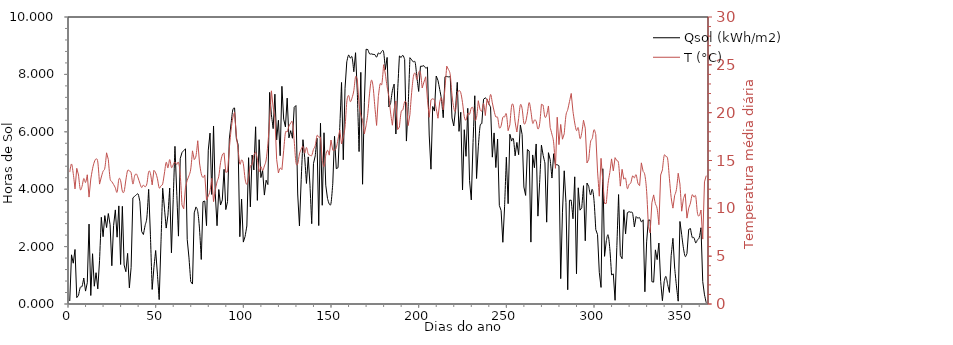
| Category | Qsol (kWh/m2) |
|---|---|
| 1.0 | 0.103 |
| 2.0 | 1.714 |
| 3.0 | 1.421 |
| 4.0 | 1.9 |
| 5.0 | 0.222 |
| 6.0 | 0.301 |
| 7.0 | 0.579 |
| 8.0 | 0.615 |
| 9.0 | 0.905 |
| 10.0 | 0.449 |
| 11.0 | 0.74 |
| 12.0 | 2.784 |
| 13.0 | 0.296 |
| 14.0 | 1.752 |
| 15.0 | 0.619 |
| 16.0 | 1.091 |
| 17.0 | 0.527 |
| 18.0 | 1.522 |
| 19.0 | 3.022 |
| 20.0 | 2.345 |
| 21.0 | 3.08 |
| 22.0 | 2.663 |
| 23.0 | 3.152 |
| 24.0 | 2.765 |
| 25.0 | 1.333 |
| 26.0 | 2.736 |
| 27.0 | 3.279 |
| 28.0 | 2.328 |
| 29.0 | 3.418 |
| 30.0 | 1.377 |
| 31.0 | 3.404 |
| 32.0 | 1.36 |
| 33.0 | 1.125 |
| 34.0 | 1.764 |
| 35.0 | 0.563 |
| 36.0 | 1.277 |
| 37.0 | 3.698 |
| 38.0 | 3.753 |
| 39.0 | 3.804 |
| 40.0 | 3.83 |
| 41.0 | 3.566 |
| 42.0 | 2.527 |
| 43.0 | 2.421 |
| 44.0 | 2.741 |
| 45.0 | 3.03 |
| 46.0 | 3.994 |
| 47.0 | 2.412 |
| 48.0 | 0.507 |
| 49.0 | 1.278 |
| 50.0 | 1.864 |
| 51.0 | 1.039 |
| 52.0 | 0.153 |
| 53.0 | 2.093 |
| 54.0 | 4.034 |
| 55.0 | 3.34 |
| 56.0 | 2.646 |
| 57.0 | 3.095 |
| 58.0 | 4.04 |
| 59.0 | 1.784 |
| 60.0 | 3.638 |
| 61.0 | 5.493 |
| 62.0 | 3.906 |
| 63.0 | 2.365 |
| 64.0 | 5.064 |
| 65.0 | 5.274 |
| 66.0 | 5.35 |
| 67.0 | 5.405 |
| 68.0 | 2.245 |
| 69.0 | 1.607 |
| 70.0 | 0.778 |
| 71.0 | 0.695 |
| 72.0 | 3.177 |
| 73.0 | 3.383 |
| 74.0 | 3.219 |
| 75.0 | 2.616 |
| 76.0 | 1.551 |
| 77.0 | 3.566 |
| 78.0 | 3.588 |
| 79.0 | 2.73 |
| 80.0 | 5.361 |
| 81.0 | 5.955 |
| 82.0 | 3.816 |
| 83.0 | 6.203 |
| 84.0 | 3.836 |
| 85.0 | 2.727 |
| 86.0 | 3.988 |
| 87.0 | 3.448 |
| 88.0 | 3.626 |
| 89.0 | 4.694 |
| 90.0 | 3.29 |
| 91.0 | 3.572 |
| 92.0 | 5.747 |
| 93.0 | 6.291 |
| 94.0 | 6.764 |
| 95.0 | 6.831 |
| 96.0 | 5.776 |
| 97.0 | 5.557 |
| 98.0 | 2.344 |
| 99.0 | 3.655 |
| 100.0 | 2.157 |
| 101.0 | 2.354 |
| 102.0 | 2.718 |
| 103.0 | 5.098 |
| 104.0 | 3.384 |
| 105.0 | 5.191 |
| 106.0 | 4.671 |
| 107.0 | 6.175 |
| 108.0 | 3.61 |
| 109.0 | 5.725 |
| 110.0 | 4.405 |
| 111.0 | 4.651 |
| 112.0 | 3.796 |
| 113.0 | 4.312 |
| 114.0 | 4.162 |
| 115.0 | 7.374 |
| 116.0 | 6.591 |
| 117.0 | 6.111 |
| 118.0 | 7.311 |
| 119.0 | 5.715 |
| 120.0 | 6.401 |
| 121.0 | 5.167 |
| 122.0 | 7.585 |
| 123.0 | 6.442 |
| 124.0 | 6.17 |
| 125.0 | 7.173 |
| 126.0 | 5.789 |
| 127.0 | 6.039 |
| 128.0 | 5.775 |
| 129.0 | 6.854 |
| 130.0 | 6.915 |
| 131.0 | 3.833 |
| 132.0 | 2.721 |
| 133.0 | 4.343 |
| 134.0 | 5.724 |
| 135.0 | 5.096 |
| 136.0 | 4.2 |
| 137.0 | 5.126 |
| 138.0 | 4.142 |
| 139.0 | 2.797 |
| 140.0 | 4.893 |
| 141.0 | 5.162 |
| 142.0 | 5.775 |
| 143.0 | 2.732 |
| 144.0 | 6.298 |
| 145.0 | 3.44 |
| 146.0 | 5.967 |
| 147.0 | 4.14 |
| 148.0 | 3.675 |
| 149.0 | 3.486 |
| 150.0 | 3.511 |
| 151.0 | 4.189 |
| 152.0 | 5.842 |
| 153.0 | 4.716 |
| 154.0 | 4.749 |
| 155.0 | 6.144 |
| 156.0 | 7.718 |
| 157.0 | 5.026 |
| 158.0 | 7.516 |
| 159.0 | 8.439 |
| 160.0 | 8.672 |
| 161.0 | 8.567 |
| 162.0 | 8.603 |
| 163.0 | 8.094 |
| 164.0 | 8.756 |
| 165.0 | 7.38 |
| 166.0 | 5.311 |
| 167.0 | 8.071 |
| 168.0 | 4.172 |
| 169.0 | 7.011 |
| 170.0 | 8.876 |
| 171.0 | 8.866 |
| 172.0 | 8.716 |
| 173.0 | 8.716 |
| 174.0 | 8.696 |
| 175.0 | 8.689 |
| 176.0 | 8.601 |
| 177.0 | 8.745 |
| 178.0 | 8.714 |
| 179.0 | 8.809 |
| 180.0 | 8.777 |
| 181.0 | 8.17 |
| 182.0 | 8.591 |
| 183.0 | 6.865 |
| 184.0 | 6.991 |
| 185.0 | 7.432 |
| 186.0 | 7.661 |
| 187.0 | 5.923 |
| 188.0 | 7.431 |
| 189.0 | 8.643 |
| 190.0 | 8.589 |
| 191.0 | 8.665 |
| 192.0 | 8.525 |
| 193.0 | 5.677 |
| 194.0 | 6.874 |
| 195.0 | 8.582 |
| 196.0 | 8.508 |
| 197.0 | 8.433 |
| 198.0 | 8.417 |
| 199.0 | 7.889 |
| 200.0 | 7.406 |
| 201.0 | 8.283 |
| 202.0 | 8.285 |
| 203.0 | 8.301 |
| 204.0 | 8.222 |
| 205.0 | 8.252 |
| 206.0 | 5.888 |
| 207.0 | 4.697 |
| 208.0 | 6.881 |
| 209.0 | 6.722 |
| 210.0 | 7.944 |
| 211.0 | 7.791 |
| 212.0 | 7.475 |
| 213.0 | 7.118 |
| 214.0 | 6.492 |
| 215.0 | 7.917 |
| 216.0 | 7.93 |
| 217.0 | 7.914 |
| 218.0 | 7.927 |
| 219.0 | 6.483 |
| 220.0 | 6.205 |
| 221.0 | 6.778 |
| 222.0 | 7.722 |
| 223.0 | 6.015 |
| 224.0 | 6.681 |
| 225.0 | 3.972 |
| 226.0 | 6.072 |
| 227.0 | 5.145 |
| 228.0 | 6.818 |
| 229.0 | 4.306 |
| 230.0 | 3.626 |
| 231.0 | 5.627 |
| 232.0 | 7.256 |
| 233.0 | 4.372 |
| 234.0 | 5.475 |
| 235.0 | 6.194 |
| 236.0 | 6.283 |
| 237.0 | 7.136 |
| 238.0 | 7.183 |
| 239.0 | 7.125 |
| 240.0 | 6.983 |
| 241.0 | 6.862 |
| 242.0 | 5.116 |
| 243.0 | 5.961 |
| 244.0 | 4.754 |
| 245.0 | 5.747 |
| 246.0 | 3.434 |
| 247.0 | 3.254 |
| 248.0 | 2.15 |
| 249.0 | 3.406 |
| 250.0 | 5.116 |
| 251.0 | 3.495 |
| 252.0 | 5.915 |
| 253.0 | 5.676 |
| 254.0 | 5.754 |
| 255.0 | 5.163 |
| 256.0 | 5.631 |
| 257.0 | 5.202 |
| 258.0 | 6.235 |
| 259.0 | 5.903 |
| 260.0 | 4.076 |
| 261.0 | 3.783 |
| 262.0 | 5.383 |
| 263.0 | 5.332 |
| 264.0 | 2.156 |
| 265.0 | 5.193 |
| 266.0 | 4.748 |
| 267.0 | 5.576 |
| 268.0 | 3.061 |
| 269.0 | 4.239 |
| 270.0 | 5.536 |
| 271.0 | 5.175 |
| 272.0 | 4.913 |
| 273.0 | 2.851 |
| 274.0 | 5.272 |
| 275.0 | 5.026 |
| 276.0 | 4.389 |
| 277.0 | 5.236 |
| 278.0 | 4.852 |
| 279.0 | 4.852 |
| 280.0 | 4.818 |
| 281.0 | 0.883 |
| 282.0 | 3.2 |
| 283.0 | 4.641 |
| 284.0 | 3.531 |
| 285.0 | 0.497 |
| 286.0 | 3.616 |
| 287.0 | 3.616 |
| 288.0 | 2.97 |
| 289.0 | 4.431 |
| 290.0 | 1.053 |
| 291.0 | 4.049 |
| 292.0 | 3.269 |
| 293.0 | 3.352 |
| 294.0 | 4.122 |
| 295.0 | 2.203 |
| 296.0 | 4.215 |
| 297.0 | 4.092 |
| 298.0 | 3.799 |
| 299.0 | 3.996 |
| 300.0 | 3.606 |
| 301.0 | 2.595 |
| 302.0 | 2.418 |
| 303.0 | 1.106 |
| 304.0 | 0.578 |
| 305.0 | 4.713 |
| 306.0 | 1.66 |
| 307.0 | 2.203 |
| 308.0 | 2.41 |
| 309.0 | 1.926 |
| 310.0 | 1.014 |
| 311.0 | 1.047 |
| 312.0 | 0.128 |
| 313.0 | 1.971 |
| 314.0 | 3.813 |
| 315.0 | 1.691 |
| 316.0 | 1.577 |
| 317.0 | 3.286 |
| 318.0 | 2.444 |
| 319.0 | 3.181 |
| 320.0 | 3.217 |
| 321.0 | 3.193 |
| 322.0 | 3.158 |
| 323.0 | 2.687 |
| 324.0 | 3.046 |
| 325.0 | 2.993 |
| 326.0 | 3.007 |
| 327.0 | 2.863 |
| 328.0 | 2.934 |
| 329.0 | 0.426 |
| 330.0 | 2.165 |
| 331.0 | 2.929 |
| 332.0 | 2.919 |
| 333.0 | 0.777 |
| 334.0 | 0.762 |
| 335.0 | 1.887 |
| 336.0 | 1.545 |
| 337.0 | 2.125 |
| 338.0 | 0.79 |
| 339.0 | 0.115 |
| 340.0 | 0.781 |
| 341.0 | 0.962 |
| 342.0 | 0.679 |
| 343.0 | 0.402 |
| 344.0 | 1.694 |
| 345.0 | 2.289 |
| 346.0 | 1.251 |
| 347.0 | 0.631 |
| 348.0 | 0.098 |
| 349.0 | 2.876 |
| 350.0 | 2.413 |
| 351.0 | 1.944 |
| 352.0 | 1.654 |
| 353.0 | 1.761 |
| 354.0 | 2.598 |
| 355.0 | 2.63 |
| 356.0 | 2.322 |
| 357.0 | 2.313 |
| 358.0 | 2.129 |
| 359.0 | 2.238 |
| 360.0 | 2.314 |
| 361.0 | 2.658 |
| 362.0 | 0.781 |
| 363.0 | 0.319 |
| 364.0 | 0.042 |